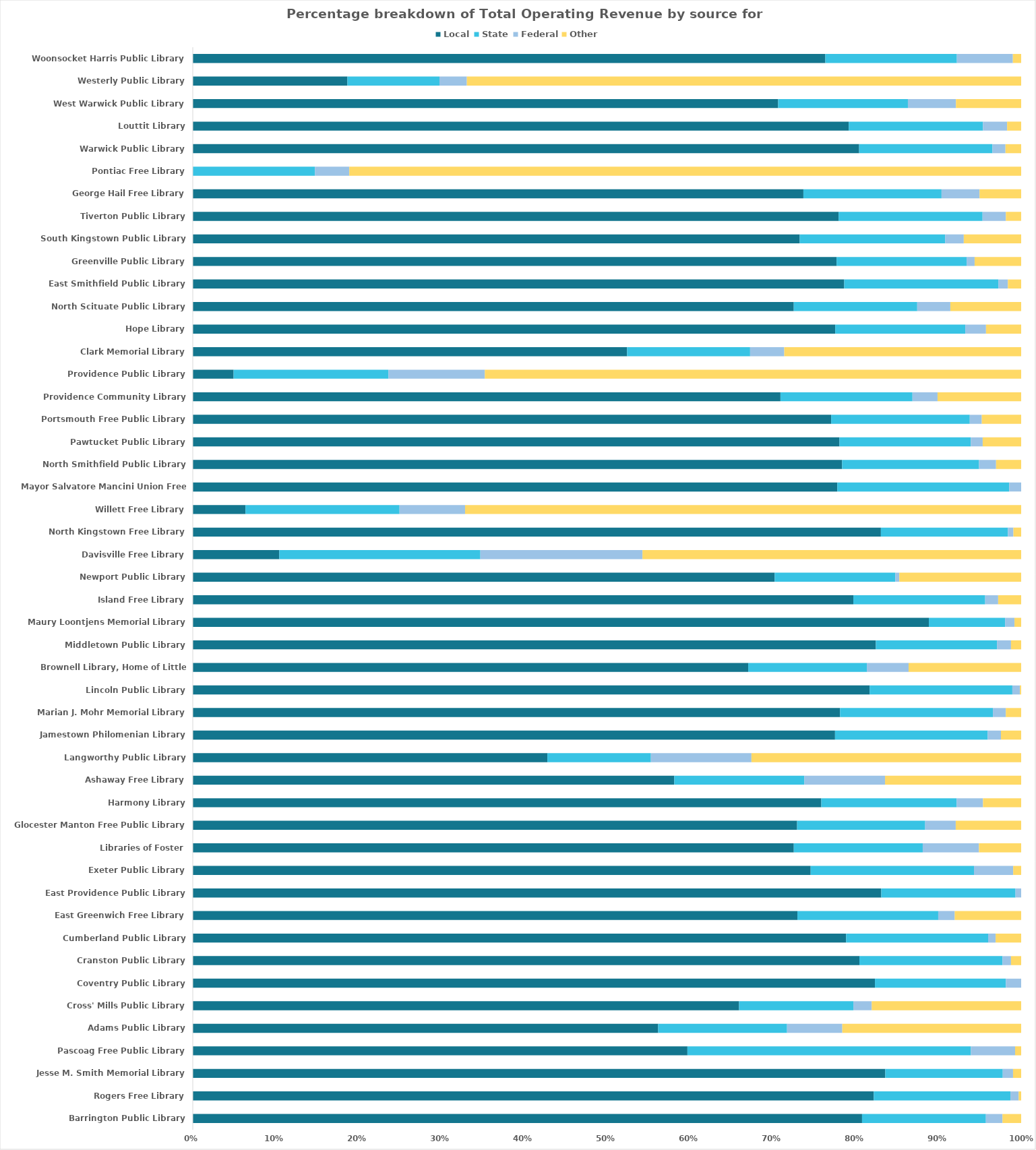
| Category | Series 0 | Local | State | Federal | Other |
|---|---|---|---|---|---|
| Barrington Public Library |  | 0.808 | 0.15 | 0.02 | 0.023 |
| Rogers Free Library |  | 0.822 | 0.165 | 0.01 | 0.003 |
| Jesse M. Smith Memorial Library |  | 0.836 | 0.142 | 0.012 | 0.01 |
| Pascoag Free Public Library |  | 0.597 | 0.342 | 0.053 | 0.007 |
| Adams Public Library |  | 0.562 | 0.156 | 0.067 | 0.216 |
| Cross' Mills Public Library |  | 0.659 | 0.138 | 0.022 | 0.18 |
| Coventry Public Library |  | 0.823 | 0.158 | 0.018 | 0 |
| Cranston Public Library |  | 0.805 | 0.173 | 0.01 | 0.012 |
| Cumberland Public Library |  | 0.789 | 0.171 | 0.009 | 0.031 |
| East Greenwich Free Library |  | 0.73 | 0.17 | 0.02 | 0.08 |
| East Providence Public Library |  | 0.831 | 0.162 | 0.007 | 0 |
| Exeter Public Library |  | 0.746 | 0.197 | 0.047 | 0.01 |
| Libraries of Foster |  | 0.726 | 0.156 | 0.068 | 0.051 |
| Glocester Manton Free Public Library |  | 0.73 | 0.155 | 0.037 | 0.079 |
| Harmony Library |  | 0.759 | 0.163 | 0.032 | 0.046 |
| Ashaway Free Library |  | 0.581 | 0.157 | 0.097 | 0.164 |
| Langworthy Public Library |  | 0.428 | 0.125 | 0.121 | 0.326 |
| Jamestown Philomenian Library |  | 0.775 | 0.184 | 0.016 | 0.024 |
| Marian J. Mohr Memorial Library |  | 0.781 | 0.185 | 0.016 | 0.019 |
| Lincoln Public Library |  | 0.817 | 0.172 | 0.009 | 0.001 |
| Brownell Library, Home of Little Compton |  | 0.671 | 0.143 | 0.05 | 0.136 |
| Middletown Public Library |  | 0.825 | 0.146 | 0.017 | 0.012 |
| Maury Loontjens Memorial Library |  | 0.889 | 0.092 | 0.011 | 0.008 |
| Island Free Library |  | 0.797 | 0.159 | 0.016 | 0.028 |
| Newport Public Library |  | 0.702 | 0.146 | 0.005 | 0.147 |
| Davisville Free Library |  | 0.104 | 0.243 | 0.196 | 0.457 |
| North Kingstown Free Library |  | 0.831 | 0.153 | 0.007 | 0.009 |
| Willett Free Library |  | 0.064 | 0.186 | 0.079 | 0.671 |
| Mayor Salvatore Mancini Union Free Library |  | 0.778 | 0.208 | 0.014 | 0 |
| North Smithfield Public Library |  | 0.784 | 0.165 | 0.021 | 0.03 |
| Pawtucket Public Library |  | 0.781 | 0.159 | 0.014 | 0.046 |
| Portsmouth Free Public Library |  | 0.771 | 0.167 | 0.015 | 0.048 |
| Providence Community Library |  | 0.709 | 0.159 | 0.03 | 0.101 |
| Providence Public Library |  | 0.049 | 0.187 | 0.116 | 0.647 |
| Clark Memorial Library |  | 0.524 | 0.149 | 0.041 | 0.286 |
| Hope Library |  | 0.776 | 0.157 | 0.025 | 0.042 |
| North Scituate Public Library |  | 0.726 | 0.149 | 0.04 | 0.085 |
| East Smithfield Public Library |  | 0.786 | 0.186 | 0.012 | 0.016 |
| Greenville Public Library |  | 0.777 | 0.157 | 0.01 | 0.056 |
| South Kingstown Public Library |  | 0.733 | 0.176 | 0.022 | 0.069 |
| Tiverton Public Library |  | 0.78 | 0.174 | 0.028 | 0.018 |
| George Hail Free Library |  | 0.737 | 0.167 | 0.046 | 0.05 |
| Pontiac Free Library |  | 0 | 0.147 | 0.041 | 0.811 |
| Warwick Public Library |  | 0.804 | 0.161 | 0.016 | 0.019 |
| Louttit Library |  | 0.792 | 0.162 | 0.029 | 0.017 |
| West Warwick Public Library |  | 0.707 | 0.157 | 0.058 | 0.079 |
| Westerly Public Library |  | 0.187 | 0.111 | 0.033 | 0.669 |
| Woonsocket Harris Public Library |  | 0.764 | 0.159 | 0.068 | 0.01 |